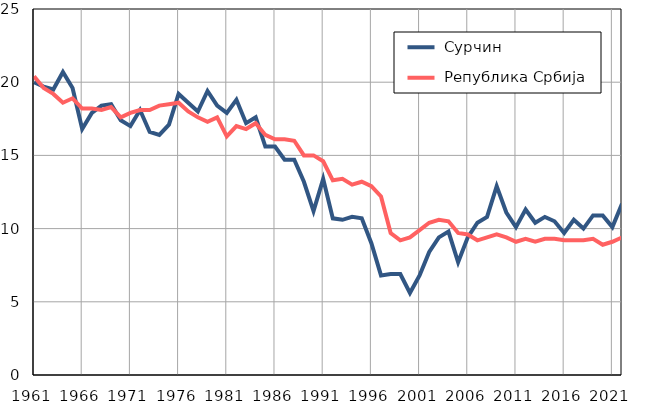
| Category |  Сурчин |  Република Србија |
|---|---|---|
| 1961.0 | 20 | 20.4 |
| 1962.0 | 19.7 | 19.6 |
| 1963.0 | 19.5 | 19.2 |
| 1964.0 | 20.7 | 18.6 |
| 1965.0 | 19.6 | 18.9 |
| 1966.0 | 16.8 | 18.2 |
| 1967.0 | 17.9 | 18.2 |
| 1968.0 | 18.4 | 18.1 |
| 1969.0 | 18.5 | 18.3 |
| 1970.0 | 17.4 | 17.6 |
| 1971.0 | 17 | 17.9 |
| 1972.0 | 18.1 | 18.1 |
| 1973.0 | 16.6 | 18.1 |
| 1974.0 | 16.4 | 18.4 |
| 1975.0 | 17.1 | 18.5 |
| 1976.0 | 19.2 | 18.6 |
| 1977.0 | 18.6 | 18 |
| 1978.0 | 18 | 17.6 |
| 1979.0 | 19.4 | 17.3 |
| 1980.0 | 18.4 | 17.6 |
| 1981.0 | 17.9 | 16.3 |
| 1982.0 | 18.8 | 17 |
| 1983.0 | 17.2 | 16.8 |
| 1984.0 | 17.6 | 17.2 |
| 1985.0 | 15.6 | 16.4 |
| 1986.0 | 15.6 | 16.1 |
| 1987.0 | 14.7 | 16.1 |
| 1988.0 | 14.7 | 16 |
| 1989.0 | 13.2 | 15 |
| 1990.0 | 11.2 | 15 |
| 1991.0 | 13.4 | 14.6 |
| 1992.0 | 10.7 | 13.3 |
| 1993.0 | 10.6 | 13.4 |
| 1994.0 | 10.8 | 13 |
| 1995.0 | 10.7 | 13.2 |
| 1996.0 | 9 | 12.9 |
| 1997.0 | 6.8 | 12.2 |
| 1998.0 | 6.9 | 9.7 |
| 1999.0 | 6.9 | 9.2 |
| 2000.0 | 5.6 | 9.4 |
| 2001.0 | 6.8 | 9.9 |
| 2002.0 | 8.4 | 10.4 |
| 2003.0 | 9.4 | 10.6 |
| 2004.0 | 9.8 | 10.5 |
| 2005.0 | 7.7 | 9.7 |
| 2006.0 | 9.4 | 9.6 |
| 2007.0 | 10.4 | 9.2 |
| 2008.0 | 10.8 | 9.4 |
| 2009.0 | 12.9 | 9.6 |
| 2010.0 | 11.1 | 9.4 |
| 2011.0 | 10.1 | 9.1 |
| 2012.0 | 11.3 | 9.3 |
| 2013.0 | 10.4 | 9.1 |
| 2014.0 | 10.8 | 9.3 |
| 2015.0 | 10.5 | 9.3 |
| 2016.0 | 9.7 | 9.2 |
| 2017.0 | 10.6 | 9.2 |
| 2018.0 | 10 | 9.2 |
| 2019.0 | 10.9 | 9.3 |
| 2020.0 | 10.9 | 8.9 |
| 2021.0 | 10.1 | 9.1 |
| 2022.0 | 11.7 | 9.4 |